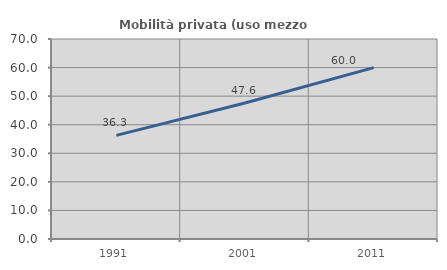
| Category | Mobilità privata (uso mezzo privato) |
|---|---|
| 1991.0 | 36.261 |
| 2001.0 | 47.609 |
| 2011.0 | 59.963 |